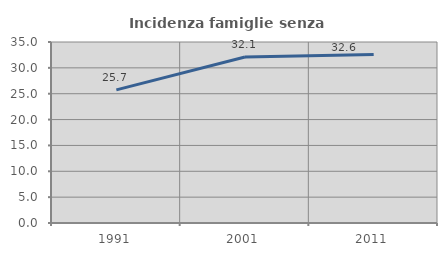
| Category | Incidenza famiglie senza nuclei |
|---|---|
| 1991.0 | 25.748 |
| 2001.0 | 32.098 |
| 2011.0 | 32.573 |